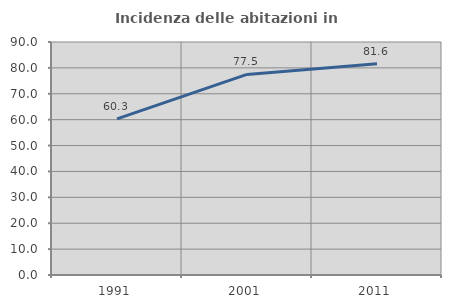
| Category | Incidenza delle abitazioni in proprietà  |
|---|---|
| 1991.0 | 60.331 |
| 2001.0 | 77.487 |
| 2011.0 | 81.633 |